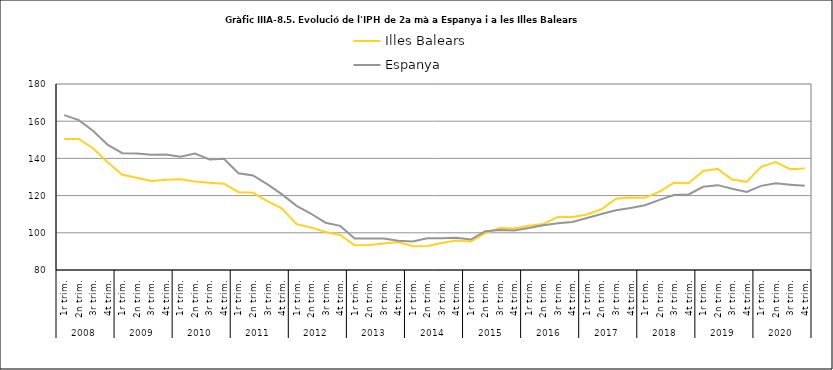
| Category | Illes Balears | Espanya |
|---|---|---|
| 0 | 150.492 | 163.288 |
| 1 | 150.457 | 160.557 |
| 2 | 145.365 | 154.722 |
| 3 | 137.781 | 147.259 |
| 4 | 131.177 | 142.815 |
| 5 | 129.638 | 142.616 |
| 6 | 127.825 | 141.958 |
| 7 | 128.507 | 142.127 |
| 8 | 128.81 | 140.838 |
| 9 | 127.522 | 142.599 |
| 10 | 126.89 | 139.455 |
| 11 | 126.398 | 139.816 |
| 12 | 121.853 | 132.007 |
| 13 | 121.526 | 130.805 |
| 14 | 117.041 | 126.055 |
| 15 | 113.054 | 120.666 |
| 16 | 104.637 | 114.514 |
| 17 | 102.878 | 110.242 |
| 18 | 100.467 | 105.43 |
| 19 | 98.851 | 103.724 |
| 20 | 93.323 | 96.996 |
| 21 | 93.437 | 96.893 |
| 22 | 94.299 | 96.992 |
| 23 | 94.991 | 95.713 |
| 24 | 92.797 | 95.321 |
| 25 | 92.945 | 97.119 |
| 26 | 94.563 | 97.131 |
| 27 | 95.912 | 97.379 |
| 28 | 95.309 | 96.373 |
| 29 | 99.777 | 100.852 |
| 30 | 102.628 | 101.534 |
| 31 | 102.287 | 101.241 |
| 32 | 103.8 | 102.533 |
| 33 | 104.737 | 104.045 |
| 34 | 108.525 | 105.084 |
| 35 | 108.474 | 105.803 |
| 36 | 109.865 | 107.983 |
| 37 | 112.648 | 110.064 |
| 38 | 118.329 | 112.131 |
| 39 | 119.016 | 113.384 |
| 40 | 118.9 | 114.81 |
| 41 | 122.1 | 117.7 |
| 42 | 126.9 | 120.32 |
| 43 | 126.6 | 120.65 |
| 44 | 133.194 | 124.72 |
| 45 | 134.372 | 125.623 |
| 46 | 128.64 | 123.659 |
| 47 | 127.397 | 121.97 |
| 48 | 135.462 | 125.222 |
| 49 | 138.026 | 126.58 |
| 50 | 134.162 | 125.875 |
| 51 | 134.537 | 125.28 |